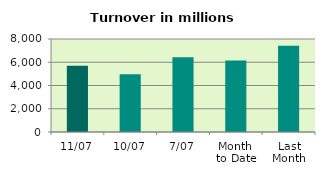
| Category | Series 0 |
|---|---|
| 11/07 | 5703.965 |
| 10/07 | 4977.393 |
| 7/07 | 6430.291 |
| Month 
to Date | 6154.167 |
| Last
Month | 7424.465 |